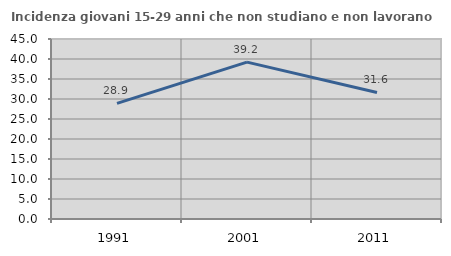
| Category | Incidenza giovani 15-29 anni che non studiano e non lavorano  |
|---|---|
| 1991.0 | 28.889 |
| 2001.0 | 39.212 |
| 2011.0 | 31.633 |